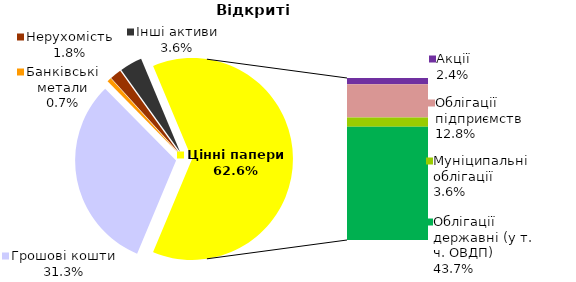
| Category | Відкриті |
|---|---|
| Грошові кошти | 496.329 |
| Банківські метали | 10.719 |
| Нерухомість | 28.941 |
| Інші активи | 56.838 |
| Акції | 38.358 |
| Облігації підприємств | 203.73 |
| Муніципальні облігації | 57.325 |
| Облігації державні (у т. ч. ОВДП) | 693.64 |